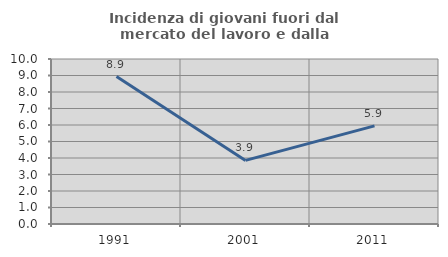
| Category | Incidenza di giovani fuori dal mercato del lavoro e dalla formazione  |
|---|---|
| 1991.0 | 8.937 |
| 2001.0 | 3.855 |
| 2011.0 | 5.948 |